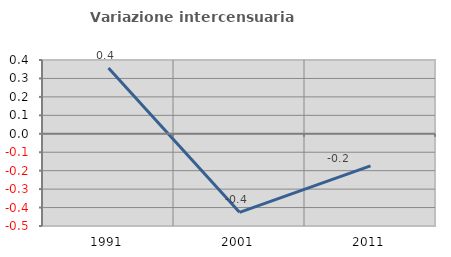
| Category | Variazione intercensuaria annua |
|---|---|
| 1991.0 | 0.357 |
| 2001.0 | -0.426 |
| 2011.0 | -0.174 |